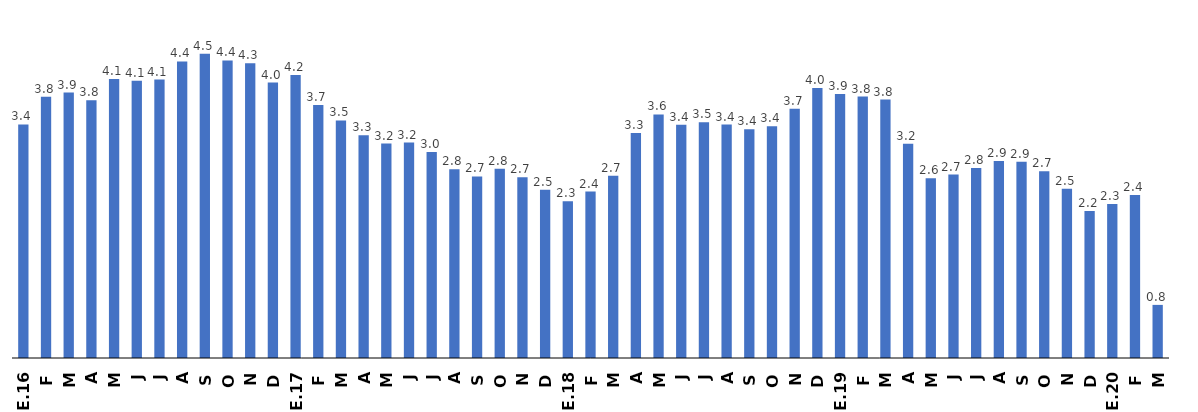
| Category | Series 0 |
|---|---|
| E.16 | 3.435 |
| F | 3.843 |
| M | 3.904 |
| A | 3.791 |
| M | 4.103 |
| J | 4.076 |
| J | 4.094 |
| A | 4.362 |
| S | 4.474 |
| O | 4.376 |
| N | 4.334 |
| D | 4.05 |
| E.17 | 4.162 |
| F | 3.72 |
| M | 3.493 |
| A | 3.277 |
| M | 3.154 |
| J | 3.169 |
| J | 3.028 |
| A | 2.774 |
| S | 2.671 |
| O | 2.781 |
| N | 2.657 |
| D | 2.475 |
| E.18 | 2.305 |
| F | 2.447 |
| M | 2.68 |
| A | 3.308 |
| M | 3.581 |
| J | 3.43 |
| J | 3.468 |
| A | 3.433 |
| S | 3.363 |
| O | 3.407 |
| N | 3.665 |
| D | 3.969 |
| E.19 | 3.881 |
| F | 3.844 |
| M | 3.801 |
| A | 3.152 |
| M | 2.644 |
| J | 2.698 |
| J | 2.795 |
| A | 2.897 |
| S | 2.887 |
| O | 2.747 |
| N | 2.49 |
| D | 2.162 |
| E.20 | 2.264 |
| F | 2.396 |
| M | 0.781 |